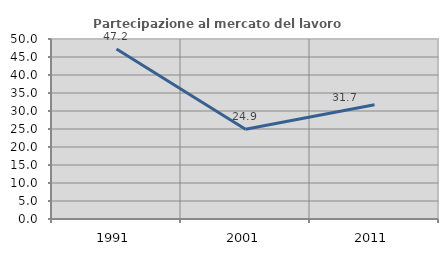
| Category | Partecipazione al mercato del lavoro  femminile |
|---|---|
| 1991.0 | 47.249 |
| 2001.0 | 24.922 |
| 2011.0 | 31.723 |